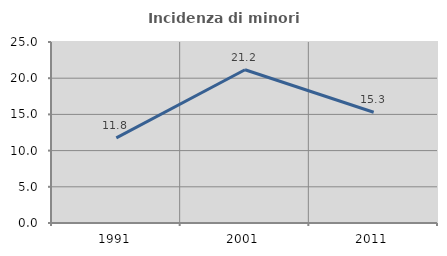
| Category | Incidenza di minori stranieri |
|---|---|
| 1991.0 | 11.765 |
| 2001.0 | 21.168 |
| 2011.0 | 15.294 |